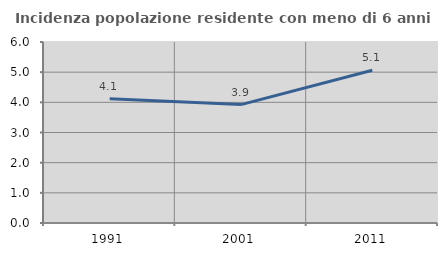
| Category | Incidenza popolazione residente con meno di 6 anni |
|---|---|
| 1991.0 | 4.121 |
| 2001.0 | 3.924 |
| 2011.0 | 5.064 |